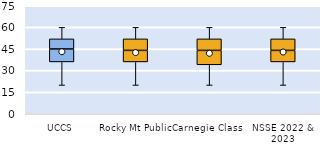
| Category | 25th | 50th | 75th |
|---|---|---|---|
| UCCS | 36 | 9 | 7 |
| Rocky Mt Public | 36 | 8 | 8 |
| Carnegie Class | 34 | 10 | 8 |
| NSSE 2022 & 2023 | 36 | 8 | 8 |